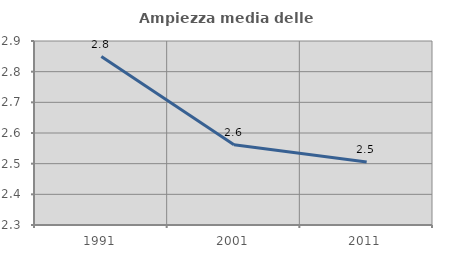
| Category | Ampiezza media delle famiglie |
|---|---|
| 1991.0 | 2.849 |
| 2001.0 | 2.562 |
| 2011.0 | 2.506 |